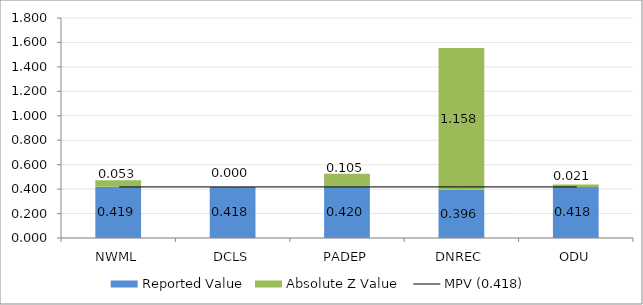
| Category | Reported Value | Absolute Z Value  |
|---|---|---|
| NWML | 0.419 | 0.053 |
| DCLS | 0.418 | 0 |
| PADEP | 0.42 | 0.105 |
| DNREC | 0.396 | 1.158 |
| ODU | 0.418 | 0.021 |